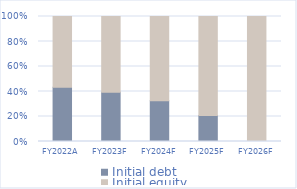
| Category | Initial debt | Initial equity |
|---|---|---|
| 2022.0 | 3000 | 3900 |
| 2023.0 | 2541.5 | 3900 |
| 2024.0 | 1890.899 | 3900 |
| 2025.0 | 1022.503 | 3900 |
| 2026.0 | 0 | 3900 |